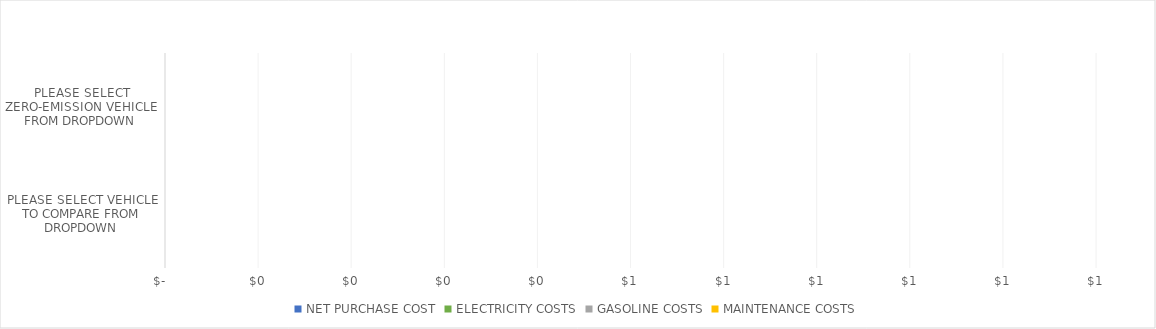
| Category | NET PURCHASE COST | ELECTRICITY COSTS | GASOLINE COSTS | MAINTENANCE COSTS |
|---|---|---|---|---|
| PLEASE SELECT VEHICLE TO COMPARE FROM DROPDOWN | 0 |  |  | 0 |
| PLEASE SELECT ZERO-EMISSION VEHICLE FROM DROPDOWN | 0 |  |  | 0 |